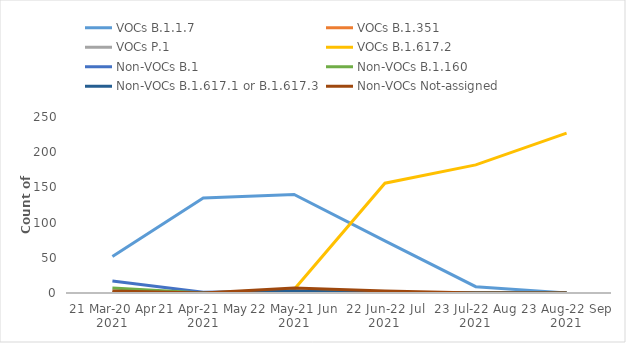
| Category | VOCs | Non-VOCs |
|---|---|---|
| 21 Mar-20 Apr 2021 | 0 | 3 |
| 21 Apr-21 May 2021 | 0 | 0 |
| 22 May-21 Jun 2021 | 5 | 7 |
| 22 Jun-22 Jul 2021 | 156 | 3 |
| 23 Jul-22 Aug 2021 | 182 | 0 |
| 23 Aug-22 Sep 2021 | 227 | 0 |